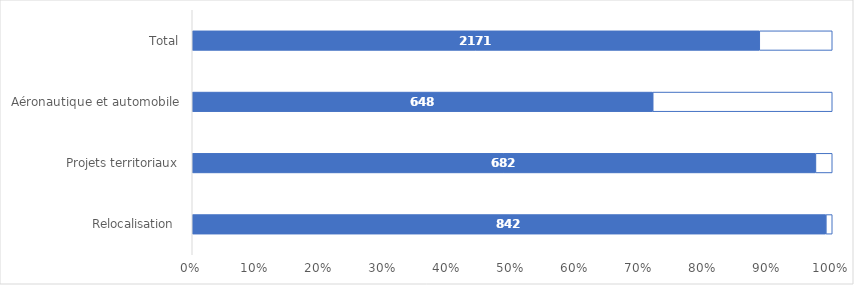
| Category | Taux d'engagement | Part non engagé |
|---|---|---|
| Relocalisation  | 0.99 | 0.01 |
| Projets territoriaux | 0.974 | 0.026 |
| Aéronautique et automobile | 0.72 | 0.28 |
| Total | 0.886 | 0.114 |